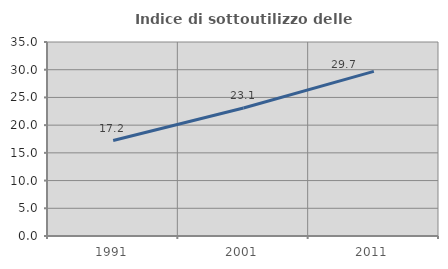
| Category | Indice di sottoutilizzo delle abitazioni  |
|---|---|
| 1991.0 | 17.217 |
| 2001.0 | 23.096 |
| 2011.0 | 29.705 |